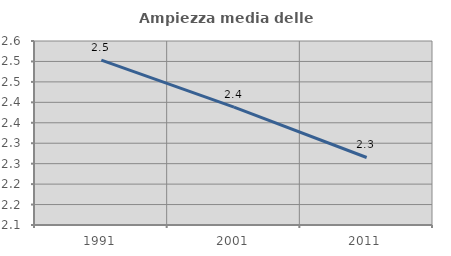
| Category | Ampiezza media delle famiglie |
|---|---|
| 1991.0 | 2.503 |
| 2001.0 | 2.388 |
| 2011.0 | 2.265 |